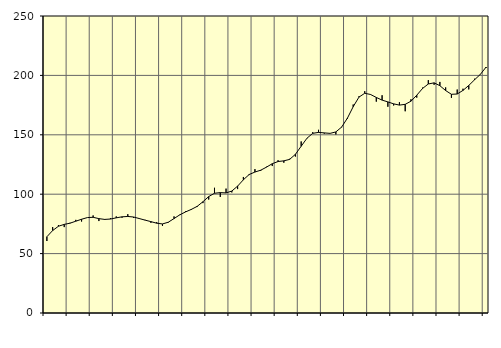
| Category | Piggar | Series 1 |
|---|---|---|
| nan | 60.6 | 64.18 |
| 1.0 | 72.3 | 69.42 |
| 1.0 | 74 | 73.02 |
| 1.0 | 72.3 | 74.6 |
| nan | 75.9 | 75.59 |
| 2.0 | 78.4 | 77.27 |
| 2.0 | 77 | 78.91 |
| 2.0 | 80.3 | 80.33 |
| nan | 82.1 | 80.56 |
| 3.0 | 77.4 | 79.43 |
| 3.0 | 78.4 | 78.78 |
| 3.0 | 79.8 | 79.09 |
| nan | 81.3 | 80.1 |
| 4.0 | 80.2 | 80.96 |
| 4.0 | 83.2 | 81.26 |
| 4.0 | 80 | 80.8 |
| nan | 79.8 | 79.49 |
| 5.0 | 78.4 | 78.16 |
| 5.0 | 75.9 | 76.92 |
| 5.0 | 76.5 | 75.58 |
| nan | 73.3 | 74.96 |
| 6.0 | 76.1 | 76.41 |
| 6.0 | 81.3 | 79.49 |
| 6.0 | 82.4 | 82.65 |
| nan | 85.7 | 85.1 |
| 7.0 | 86.8 | 87.22 |
| 7.0 | 89.2 | 89.75 |
| 7.0 | 92.5 | 93.65 |
| nan | 95.5 | 98 |
| 8.0 | 105.4 | 100.79 |
| 8.0 | 97.7 | 101.33 |
| 8.0 | 104.7 | 101.09 |
| nan | 101.5 | 102.65 |
| 9.0 | 104.3 | 106.79 |
| 9.0 | 114.5 | 112.14 |
| 9.0 | 116.1 | 116.56 |
| nan | 121.1 | 118.66 |
| 10.0 | 119.6 | 120.2 |
| 10.0 | 123.1 | 122.78 |
| 10.0 | 123.7 | 125.68 |
| nan | 128.6 | 127.49 |
| 11.0 | 126.5 | 128.08 |
| 11.0 | 129.8 | 129.3 |
| 11.0 | 131.7 | 133.56 |
| nan | 144.4 | 140.38 |
| 12.0 | 147.3 | 147.12 |
| 12.0 | 152.2 | 151.23 |
| 12.0 | 154.2 | 152.04 |
| nan | 151 | 151.6 |
| 13.0 | 151.2 | 151.21 |
| 13.0 | 150.3 | 152.41 |
| 13.0 | 156.2 | 156.51 |
| nan | 163.4 | 164.01 |
| 14.0 | 175.5 | 173.66 |
| 14.0 | 182.4 | 181.72 |
| 14.0 | 186.7 | 184.95 |
| nan | 183.7 | 183.94 |
| 15.0 | 177.9 | 181.44 |
| 15.0 | 183.3 | 179.19 |
| 15.0 | 173.6 | 177.7 |
| nan | 174.7 | 176.05 |
| 16.0 | 177.4 | 175 |
| 16.0 | 169.8 | 175.64 |
| 16.0 | 179.9 | 178.27 |
| nan | 181.3 | 183.33 |
| 17.0 | 189.7 | 188.99 |
| 17.0 | 196 | 192.78 |
| 17.0 | 192.1 | 193.73 |
| nan | 194.5 | 191.33 |
| 18.0 | 189.9 | 187.25 |
| 18.0 | 181.1 | 184.1 |
| 18.0 | 188.1 | 184.33 |
| nan | 188.8 | 187.38 |
| 19.0 | 188.2 | 191.53 |
| 19.0 | 197.2 | 196.3 |
| 19.0 | 201.1 | 200.85 |
| nan | 206.3 | 207.04 |